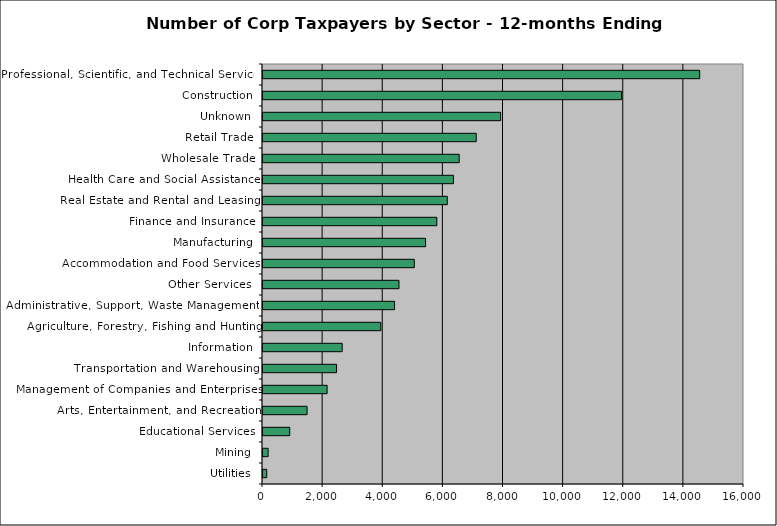
| Category | Count |
|---|---|
| Utilities | 125 |
| Mining | 170 |
| Educational Services | 890 |
| Arts, Entertainment, and Recreation | 1466 |
| Management of Companies and Enterprises | 2133 |
| Transportation and Warehousing | 2446 |
| Information | 2634 |
| Agriculture, Forestry, Fishing and Hunting | 3918 |
| Administrative, Support, Waste Management, | 4376 |
| Other Services  | 4523 |
| Accommodation and Food Services | 5032 |
| Manufacturing | 5408 |
| Finance and Insurance | 5782 |
| Real Estate and Rental and Leasing | 6130 |
| Health Care and Social Assistance | 6336 |
| Wholesale Trade | 6526 |
| Retail Trade | 7092 |
| Unknown | 7905 |
| Construction | 11926 |
| Professional, Scientific, and Technical Services | 14527 |